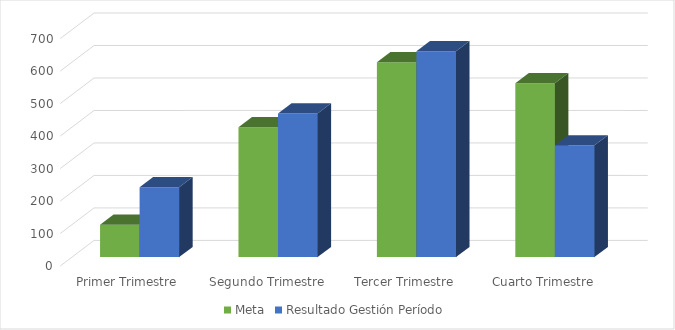
| Category | Meta | Resultado Gestión Período |
|---|---|---|
| Primer Trimestre | 100 | 215 |
| Segundo Trimestre | 400 | 442 |
| Tercer Trimestre | 600 | 634 |
| Cuarto Trimestre | 535 | 344 |